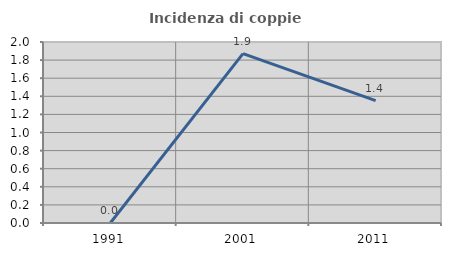
| Category | Incidenza di coppie miste |
|---|---|
| 1991.0 | 0 |
| 2001.0 | 1.872 |
| 2011.0 | 1.351 |